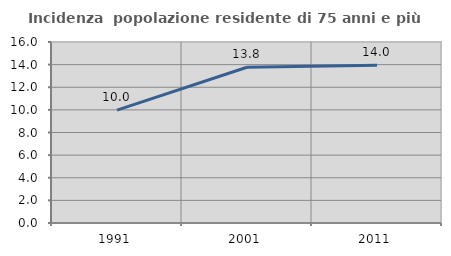
| Category | Incidenza  popolazione residente di 75 anni e più |
|---|---|
| 1991.0 | 9.981 |
| 2001.0 | 13.766 |
| 2011.0 | 13.953 |